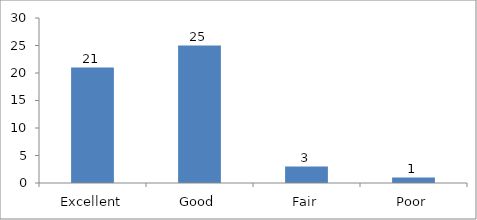
| Category | How would you rate this session or workshop? |
|---|---|
| Excellent | 21 |
| Good | 25 |
| Fair | 3 |
| Poor | 1 |